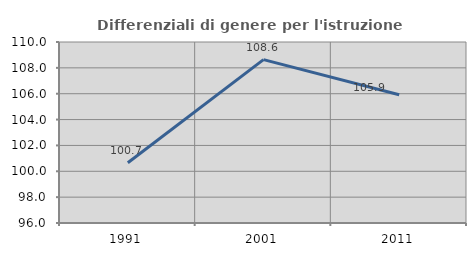
| Category | Differenziali di genere per l'istruzione superiore |
|---|---|
| 1991.0 | 100.659 |
| 2001.0 | 108.639 |
| 2011.0 | 105.924 |